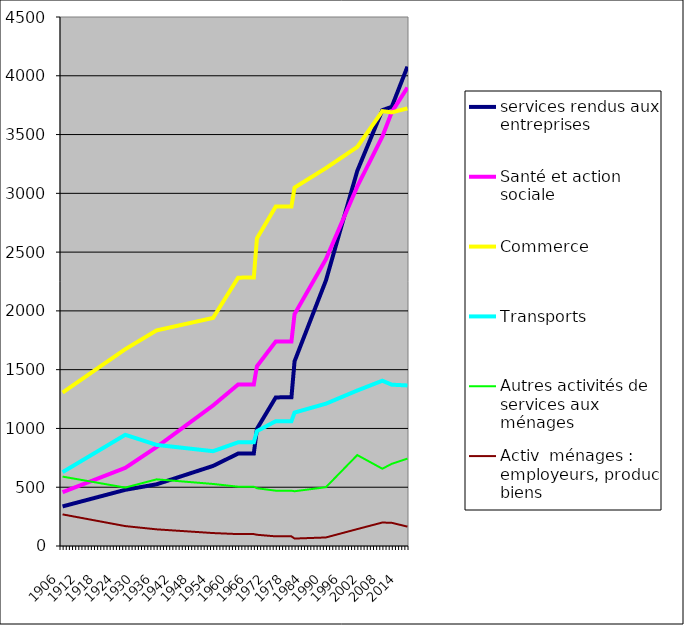
| Category | services rendus aux entreprises | Santé et action sociale | Commerce | Transports | Autres activités de services aux ménages | Activ  ménages : employeurs, produc  biens  |
|---|---|---|---|---|---|---|
| 1906.0 | 336.734 | 457.672 | 1305.161 | 628.203 | 590.239 | 268.829 |
| 1907.0 | 343.787 | 468.016 | 1323.618 | 644.083 | 585.571 | 263.854 |
| 1908.0 | 350.839 | 478.361 | 1342.075 | 659.963 | 580.904 | 258.88 |
| 1909.0 | 357.891 | 488.705 | 1360.532 | 675.843 | 576.236 | 253.906 |
| 1910.0 | 364.944 | 499.05 | 1378.99 | 691.723 | 571.568 | 248.932 |
| 1911.0 | 371.996 | 509.395 | 1397.447 | 707.602 | 566.9 | 243.958 |
| 1912.0 | 379.048 | 519.739 | 1415.904 | 723.482 | 562.232 | 238.984 |
| 1913.0 | 386.101 | 530.084 | 1434.362 | 739.362 | 557.564 | 234.01 |
| 1914.0 | 393.153 | 540.428 | 1452.819 | 755.242 | 552.897 | 229.036 |
| 1915.0 | 400.206 | 550.773 | 1471.276 | 771.122 | 548.229 | 224.062 |
| 1916.0 | 407.258 | 561.118 | 1489.734 | 787.002 | 543.561 | 219.088 |
| 1917.0 | 414.31 | 571.462 | 1508.191 | 802.882 | 538.893 | 214.114 |
| 1918.0 | 421.363 | 581.807 | 1526.648 | 818.761 | 534.225 | 209.14 |
| 1919.0 | 428.415 | 592.151 | 1545.106 | 834.641 | 529.557 | 204.166 |
| 1920.0 | 435.467 | 602.496 | 1563.563 | 850.521 | 524.89 | 199.191 |
| 1921.0 | 442.52 | 612.841 | 1582.02 | 866.401 | 520.222 | 194.217 |
| 1922.0 | 449.572 | 623.185 | 1600.477 | 882.281 | 515.554 | 189.243 |
| 1923.0 | 456.624 | 633.53 | 1618.935 | 898.161 | 510.886 | 184.269 |
| 1924.0 | 463.677 | 643.875 | 1637.392 | 914.04 | 506.218 | 179.295 |
| 1925.0 | 470.729 | 654.219 | 1655.849 | 929.92 | 501.55 | 174.321 |
| 1926.0 | 477.781 | 664.564 | 1674.307 | 945.8 | 496.883 | 169.347 |
| 1927.0 | 482.492 | 682.327 | 1690.28 | 937.222 | 503.901 | 166.577 |
| 1928.0 | 487.202 | 700.09 | 1706.254 | 928.644 | 510.919 | 163.808 |
| 1929.0 | 491.912 | 717.853 | 1722.227 | 920.066 | 517.937 | 161.038 |
| 1930.0 | 496.623 | 735.616 | 1738.201 | 911.488 | 524.955 | 158.269 |
| 1931.0 | 501.333 | 753.38 | 1754.175 | 902.909 | 531.973 | 155.499 |
| 1932.0 | 506.044 | 771.143 | 1770.148 | 894.331 | 538.991 | 152.73 |
| 1933.0 | 510.754 | 788.906 | 1786.122 | 885.753 | 546.009 | 149.96 |
| 1934.0 | 515.464 | 806.669 | 1802.096 | 877.175 | 553.027 | 147.191 |
| 1935.0 | 520.175 | 824.432 | 1818.069 | 868.597 | 560.046 | 144.421 |
| 1936.0 | 524.885 | 842.196 | 1834.043 | 860.019 | 567.064 | 141.652 |
| 1937.0 | 533.568 | 861.816 | 1839.941 | 857.041 | 564.88 | 139.899 |
| 1938.0 | 542.252 | 881.436 | 1845.839 | 854.063 | 562.697 | 138.147 |
| 1939.0 | 550.935 | 901.056 | 1851.737 | 851.085 | 560.513 | 136.395 |
| 1940.0 | 559.619 | 920.676 | 1857.635 | 848.107 | 558.33 | 134.643 |
| 1941.0 | 568.302 | 940.296 | 1863.533 | 845.13 | 556.147 | 132.89 |
| 1942.0 | 576.985 | 959.916 | 1869.431 | 842.152 | 553.963 | 131.138 |
| 1943.0 | 585.669 | 979.536 | 1875.33 | 839.174 | 551.78 | 129.386 |
| 1944.0 | 594.352 | 999.156 | 1881.228 | 836.196 | 549.596 | 127.634 |
| 1945.0 | 603.036 | 1018.776 | 1887.126 | 833.218 | 547.413 | 125.881 |
| 1946.0 | 611.719 | 1038.396 | 1893.024 | 830.241 | 545.23 | 124.129 |
| 1947.0 | 620.402 | 1058.016 | 1898.922 | 827.263 | 543.046 | 122.377 |
| 1948.0 | 629.086 | 1077.636 | 1904.82 | 824.285 | 540.863 | 120.625 |
| 1949.0 | 637.769 | 1097.256 | 1910.718 | 821.307 | 538.679 | 118.872 |
| 1950.0 | 646.453 | 1116.876 | 1916.616 | 818.329 | 536.496 | 117.12 |
| 1951.0 | 655.136 | 1136.496 | 1922.514 | 815.351 | 534.312 | 115.368 |
| 1952.0 | 663.819 | 1156.116 | 1928.413 | 812.374 | 532.129 | 113.616 |
| 1953.0 | 672.503 | 1175.736 | 1934.311 | 809.396 | 529.946 | 111.864 |
| 1954.0 | 681.186 | 1195.356 | 1940.209 | 806.418 | 527.762 | 110.111 |
| 1955.0 | 694.313 | 1217.686 | 1983.002 | 815.876 | 524.832 | 109 |
| 1956.0 | 707.44 | 1240.016 | 2025.795 | 825.334 | 521.902 | 107.889 |
| 1957.0 | 720.567 | 1262.346 | 2068.588 | 834.793 | 518.971 | 106.777 |
| 1958.0 | 733.694 | 1284.676 | 2111.381 | 844.251 | 516.041 | 105.666 |
| 1959.0 | 746.821 | 1307.006 | 2154.174 | 853.709 | 513.11 | 104.555 |
| 1960.0 | 759.948 | 1329.336 | 2196.967 | 863.167 | 510.18 | 103.443 |
| 1961.0 | 773.075 | 1351.666 | 2239.76 | 872.626 | 507.25 | 102.332 |
| 1962.0 | 786.202 | 1373.996 | 2282.553 | 882.084 | 504.319 | 101.221 |
| 1963.0 | 786.414 | 1374.151 | 2282.889 | 882.179 | 504.306 | 101.215 |
| 1964.0 | 786.625 | 1374.306 | 2283.224 | 882.274 | 504.293 | 101.209 |
| 1965.0 | 786.837 | 1374.462 | 2283.559 | 882.37 | 504.28 | 101.204 |
| 1966.0 | 787.048 | 1374.617 | 2283.895 | 882.465 | 504.267 | 101.198 |
| 1967.0 | 787.26 | 1374.772 | 2284.23 | 882.56 | 504.254 | 101.193 |
| 1968.0 | 997.142 | 1528.914 | 2616.973 | 977.074 | 491.187 | 95.592 |
| 1969.0 | 1041.626 | 1564.046 | 2662.044 | 991.195 | 487.754 | 93.32 |
| 1970.0 | 1086.11 | 1599.178 | 2707.116 | 1005.315 | 484.322 | 91.048 |
| 1971.0 | 1130.594 | 1634.311 | 2752.187 | 1019.436 | 480.889 | 88.775 |
| 1972.0 | 1175.079 | 1669.443 | 2797.258 | 1033.556 | 477.456 | 86.503 |
| 1973.0 | 1219.563 | 1704.575 | 2842.33 | 1047.677 | 474.024 | 84.23 |
| 1974.0 | 1264.047 | 1739.707 | 2887.401 | 1061.798 | 470.591 | 81.958 |
| 1975.0 | 1264.242 | 1739.855 | 2887.504 | 1061.844 | 470.588 | 81.946 |
| 1976.0 | 1264.438 | 1740.003 | 2887.607 | 1061.891 | 470.585 | 81.934 |
| 1977.0 | 1264.634 | 1740.152 | 2887.71 | 1061.938 | 470.582 | 81.922 |
| 1978.0 | 1264.829 | 1740.3 | 2887.812 | 1061.984 | 470.579 | 81.91 |
| 1979.0 | 1265.025 | 1740.448 | 2887.915 | 1062.031 | 470.576 | 81.899 |
| 1980.0 | 1571.357 | 1972.521 | 3048.847 | 1135.133 | 465.774 | 63.293 |
| 1981.0 | 1640.116 | 2019.226 | 3065.428 | 1142.682 | 469.223 | 64.227 |
| 1982.0 | 1708.874 | 2065.931 | 3082.009 | 1150.231 | 472.672 | 65.161 |
| 1983.0 | 1777.633 | 2112.636 | 3098.59 | 1157.781 | 476.121 | 66.095 |
| 1984.0 | 1846.392 | 2159.341 | 3115.172 | 1165.33 | 479.57 | 67.029 |
| 1985.0 | 1915.151 | 2206.046 | 3131.753 | 1172.88 | 483.02 | 67.963 |
| 1986.0 | 1983.909 | 2252.751 | 3148.334 | 1180.429 | 486.469 | 68.897 |
| 1987.0 | 2052.668 | 2299.456 | 3164.916 | 1187.978 | 489.918 | 69.831 |
| 1988.0 | 2121.427 | 2346.161 | 3181.497 | 1195.528 | 493.367 | 70.765 |
| 1989.0 | 2190.185 | 2392.866 | 3198.078 | 1203.077 | 496.816 | 71.699 |
| 1990.0 | 2258.944 | 2439.571 | 3214.659 | 1210.627 | 500.265 | 72.633 |
| 1991.0 | 2352.098 | 2501.422 | 3232.649 | 1221.826 | 527.591 | 79.746 |
| 1992.0 | 2445.252 | 2563.273 | 3250.639 | 1233.025 | 554.917 | 86.859 |
| 1993.0 | 2538.407 | 2625.123 | 3268.629 | 1244.223 | 582.242 | 93.971 |
| 1994.0 | 2631.561 | 2686.974 | 3286.619 | 1255.422 | 609.568 | 101.084 |
| 1995.0 | 2724.715 | 2748.825 | 3304.609 | 1266.621 | 636.894 | 108.197 |
| 1996.0 | 2817.869 | 2810.676 | 3322.599 | 1277.82 | 664.22 | 115.31 |
| 1997.0 | 2911.023 | 2872.526 | 3340.588 | 1289.019 | 691.546 | 122.423 |
| 1998.0 | 3004.177 | 2934.377 | 3358.578 | 1300.218 | 718.872 | 129.535 |
| 1999.0 | 3097.331 | 2996.228 | 3376.568 | 1311.417 | 746.198 | 136.648 |
| 2000.0 | 3190.485 | 3058.079 | 3394.558 | 1322.616 | 773.524 | 143.761 |
| 2001.0 | 3255.108 | 3111.124 | 3432.652 | 1333.027 | 758.993 | 150.759 |
| 2002.0 | 3319.731 | 3164.17 | 3470.746 | 1343.437 | 744.463 | 157.756 |
| 2003.0 | 3384.355 | 3217.216 | 3508.841 | 1353.847 | 729.932 | 164.754 |
| 2004.0 | 3448.978 | 3270.262 | 3546.935 | 1364.258 | 715.402 | 171.752 |
| 2005.0 | 3513.601 | 3323.307 | 3585.029 | 1374.668 | 700.871 | 178.75 |
| 2006.0 | 3578.224 | 3376.353 | 3623.123 | 1385.079 | 686.34 | 185.747 |
| 2007.0 | 3642.847 | 3429.399 | 3661.217 | 1395.489 | 671.81 | 192.745 |
| 2008.0 | 3707.47 | 3482.445 | 3699.311 | 1405.9 | 657.279 | 199.743 |
| 2009.0 | 3716.969 | 3551.899 | 3695.744 | 1394.69 | 671.259 | 198.893 |
| 2010.0 | 3726.468 | 3621.354 | 3692.177 | 1383.48 | 685.238 | 198.043 |
| 2011.0 | 3735.968 | 3690.809 | 3688.61 | 1372.271 | 699.217 | 197.194 |
| 2012.0 | 3804.321 | 3732.567 | 3695.441 | 1370.988 | 707.999 | 190.748 |
| 2013.0 | 3872.674 | 3774.324 | 3702.272 | 1369.704 | 716.78 | 184.302 |
| 2014.0 | 3941.027 | 3816.082 | 3709.103 | 1368.421 | 725.562 | 177.856 |
| 2015.0 | 4009.379 | 3857.84 | 3715.934 | 1367.138 | 734.343 | 171.41 |
| 2016.0 | 4077.732 | 3899.597 | 3722.765 | 1365.855 | 743.124 | 164.964 |